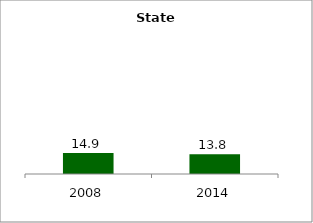
| Category | State |
|---|---|
| 2008.0 | 14.873 |
| 2014.0 | 13.846 |